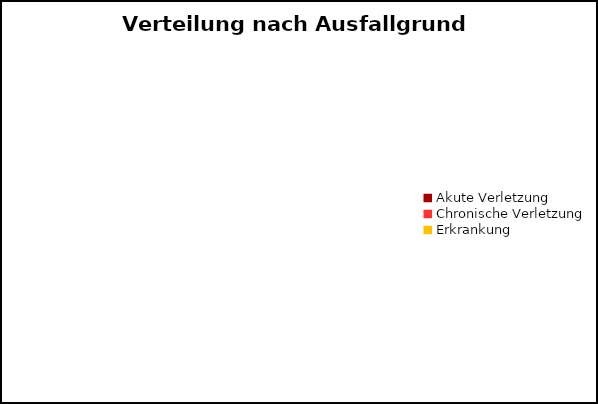
| Category | Series 0 |
|---|---|
| Akute Verletzung | 0 |
| Chronische Verletzung | 0 |
| Erkrankung | 0 |